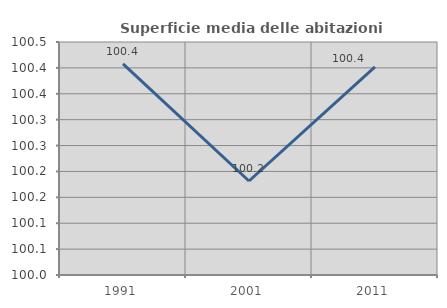
| Category | Superficie media delle abitazioni occupate |
|---|---|
| 1991.0 | 100.408 |
| 2001.0 | 100.182 |
| 2011.0 | 100.402 |